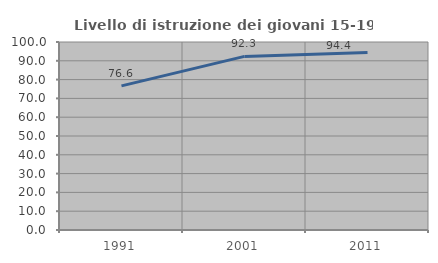
| Category | Livello di istruzione dei giovani 15-19 anni |
|---|---|
| 1991.0 | 76.647 |
| 2001.0 | 92.336 |
| 2011.0 | 94.398 |